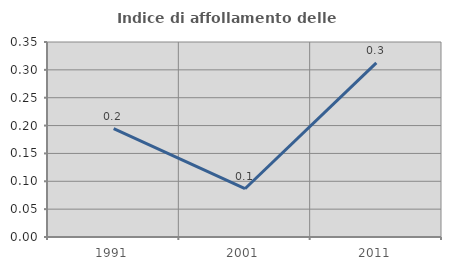
| Category | Indice di affollamento delle abitazioni  |
|---|---|
| 1991.0 | 0.194 |
| 2001.0 | 0.087 |
| 2011.0 | 0.312 |